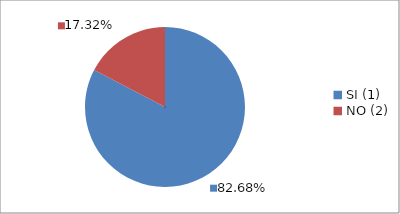
| Category | Series 0 |
|---|---|
| SI (1) | 0.827 |
| NO (2) | 0.173 |